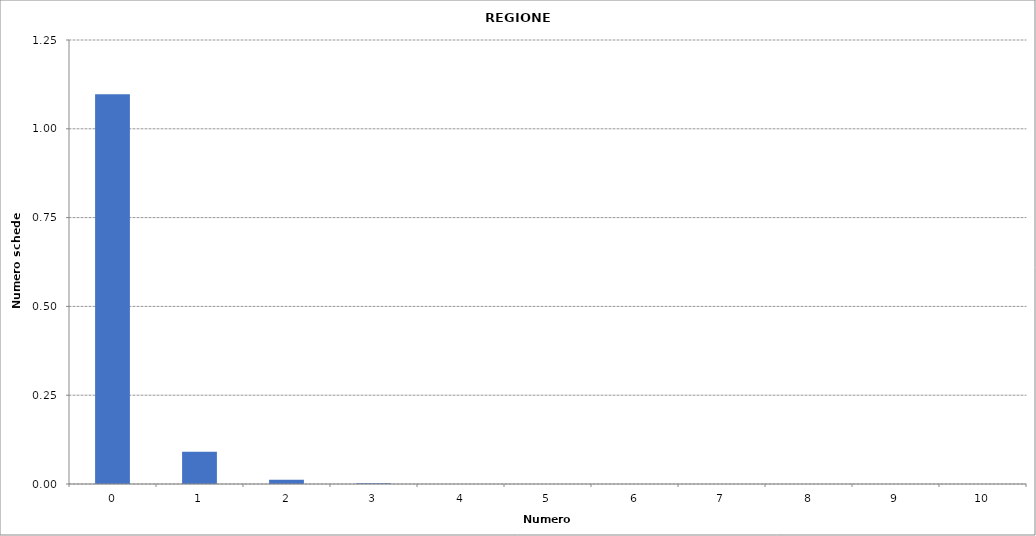
| Category | Series 0 |
|---|---|
| 0.0 | 1097359 |
| 1.0 | 90691 |
| 2.0 | 11948 |
| 3.0 | 2030 |
| 4.0 | 317 |
| 5.0 | 94 |
| 6.0 | 12 |
| 7.0 | 1 |
| 8.0 | 1 |
| 9.0 | 13 |
| 10.0 | 2 |